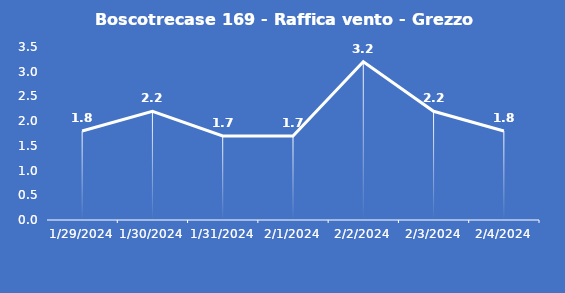
| Category | Boscotrecase 169 - Raffica vento - Grezzo (m/s) |
|---|---|
| 1/29/24 | 1.8 |
| 1/30/24 | 2.2 |
| 1/31/24 | 1.7 |
| 2/1/24 | 1.7 |
| 2/2/24 | 3.2 |
| 2/3/24 | 2.2 |
| 2/4/24 | 1.8 |